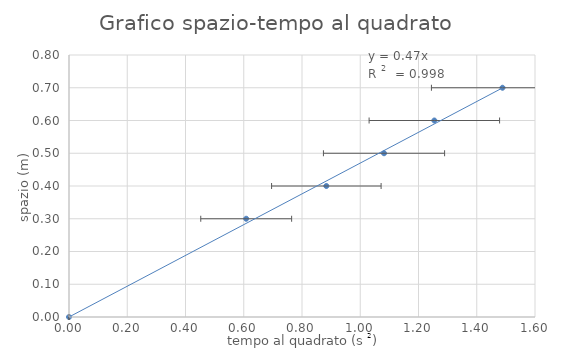
| Category | Series 0 |
|---|---|
| 0.0 | 0 |
| 0.6083999999999998 | 0.3 |
| 0.8835999999999997 | 0.4 |
| 1.0816000000000001 | 0.5 |
| 1.2543999999999997 | 0.6 |
| 1.4884000000000004 | 0.7 |